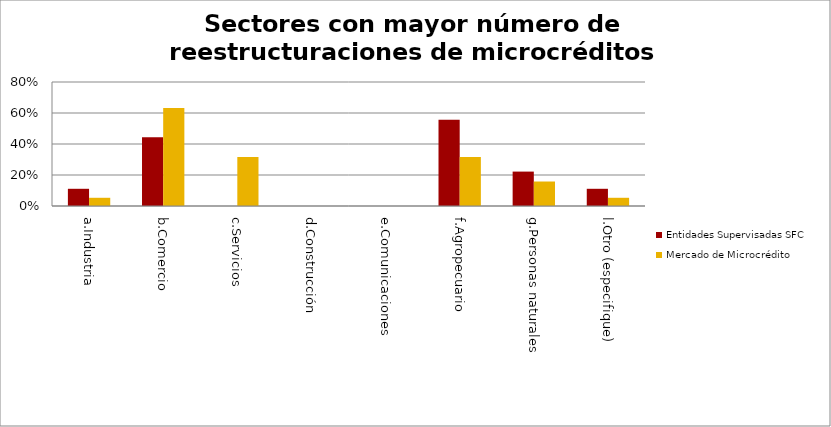
| Category | Entidades Supervisadas SFC | Mercado de Microcrédito |
|---|---|---|
| a.Industria | 0.111 | 0.053 |
| b.Comercio | 0.444 | 0.632 |
| c.Servicios | 0 | 0.316 |
| d.Construcción | 0 | 0 |
| e.Comunicaciones | 0 | 0 |
| f.Agropecuario | 0.556 | 0.316 |
| g.Personas naturales | 0.222 | 0.158 |
| l.Otro (especifique) | 0.111 | 0.053 |